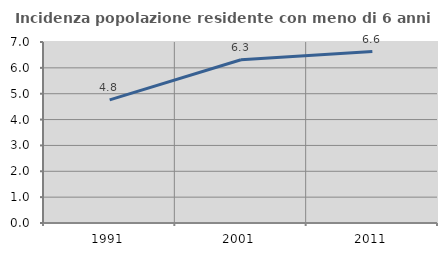
| Category | Incidenza popolazione residente con meno di 6 anni |
|---|---|
| 1991.0 | 4.76 |
| 2001.0 | 6.314 |
| 2011.0 | 6.632 |